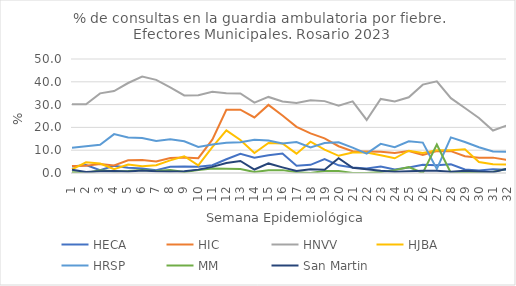
| Category | HECA | HIC | HNVV | HJBA | HRSP | MM | San Martin |
|---|---|---|---|---|---|---|---|
| 1.0 | 2.809 | 3.112 | 30.132 | 1.633 | 11.09 | 0.377 | 1.462 |
| 2.0 | 3.468 | 3.16 | 30.171 | 4.693 | 11.76 | 0 | 0.407 |
| 3.0 | 1.227 | 3.979 | 34.936 | 4.167 | 12.361 | 1.149 | 0.787 |
| 4.0 | 3.142 | 3.322 | 35.938 | 1.702 | 17.055 | 0.778 | 0.842 |
| 5.0 | 2.259 | 5.576 | 39.469 | 3.679 | 15.603 | 0.84 | 0.692 |
| 6.0 | 2.028 | 5.696 | 42.304 | 2.985 | 15.391 | 1.288 | 1.089 |
| 7.0 | 1.253 | 5.078 | 40.864 | 3.427 | 14.017 | 0.84 | 0.769 |
| 8.0 | 2.743 | 6.537 | 37.578 | 5.537 | 14.779 | 1.357 | 0.668 |
| 9.0 | 2.874 | 6.849 | 34.03 | 7.333 | 13.898 | 0.431 | 0.776 |
| 10.0 | 2.778 | 6.504 | 34.069 | 3.309 | 11.441 | 1.277 | 1.482 |
| 11.0 | 3.442 | 14.643 | 35.593 | 11.385 | 12.528 | 1.992 | 2.685 |
| 12.0 | 6.04 | 27.694 | 35.02 | 18.701 | 13.221 | 1.914 | 4.4 |
| 13.0 | 8.465 | 27.751 | 34.898 | 14.477 | 13.491 | 1.762 | 5.258 |
| 14.0 | 6.716 | 24.366 | 30.887 | 8.75 | 14.578 | 0.433 | 1.532 |
| 15.0 | 7.748 | 29.876 | 33.362 | 13.137 | 14.267 | 1.25 | 4.202 |
| 16.0 | 8.515 | 25.186 | 31.387 | 12.99 | 12.912 | 1.261 | 2.481 |
| 17.0 | 3.171 | 20.229 | 30.661 | 8.491 | 13.612 | 0.385 | 0.855 |
| 18.0 | 3.579 | 17.391 | 31.856 | 13.712 | 11.192 | 0 | 1.613 |
| 19.0 | 6.114 | 15.207 | 31.526 | 10.269 | 13.141 | 0.897 | 1.42 |
| 20.0 | 3.368 | 11.746 | 29.503 | 7.547 | 13.485 | 0.873 | 6.477 |
| 21.0 | 2.455 | 9.516 | 31.4 | 8.964 | 11.127 | 0 | 2.28 |
| 22.0 | 2.016 | 9.453 | 23.261 | 9.024 | 8.524 | 0 | 1.685 |
| 23.0 | 2.84 | 9.281 | 32.48 | 7.824 | 12.797 | 0.45 | 0.937 |
| 24.0 | 1.577 | 8.782 | 31.359 | 6.441 | 11.35 | 1.261 | 0.532 |
| 25.0 | 2.375 | 9.6 | 33.227 | 9.792 | 13.887 | 2.564 | 0.736 |
| 26.0 | 3.629 | 7.882 | 38.757 | 8.816 | 13.324 | 0 | 0.975 |
| 27.0 | 3.421 | 9.667 | 40.2 | 10.024 | 1.788 | 12.5 | 1.024 |
| 28.0 | 3.812 | 9.584 | 32.821 | 9.973 | 15.605 | 0 | 0.528 |
| 29.0 | 1.556 | 7.361 | 28.486 | 10.363 | 13.603 | 0.433 | 0.943 |
| 30.0 | 1.062 | 6.678 | 24.113 | 4.85 | 11.321 | 0.476 | 0.685 |
| 31.0 | 1.629 | 6.738 | 18.621 | 3.883 | 9.411 | 0.457 | 0.369 |
| 32.0 | 1.386 | 5.72 | 20.874 | 3.714 | 9.273 | 1.887 | 1.838 |